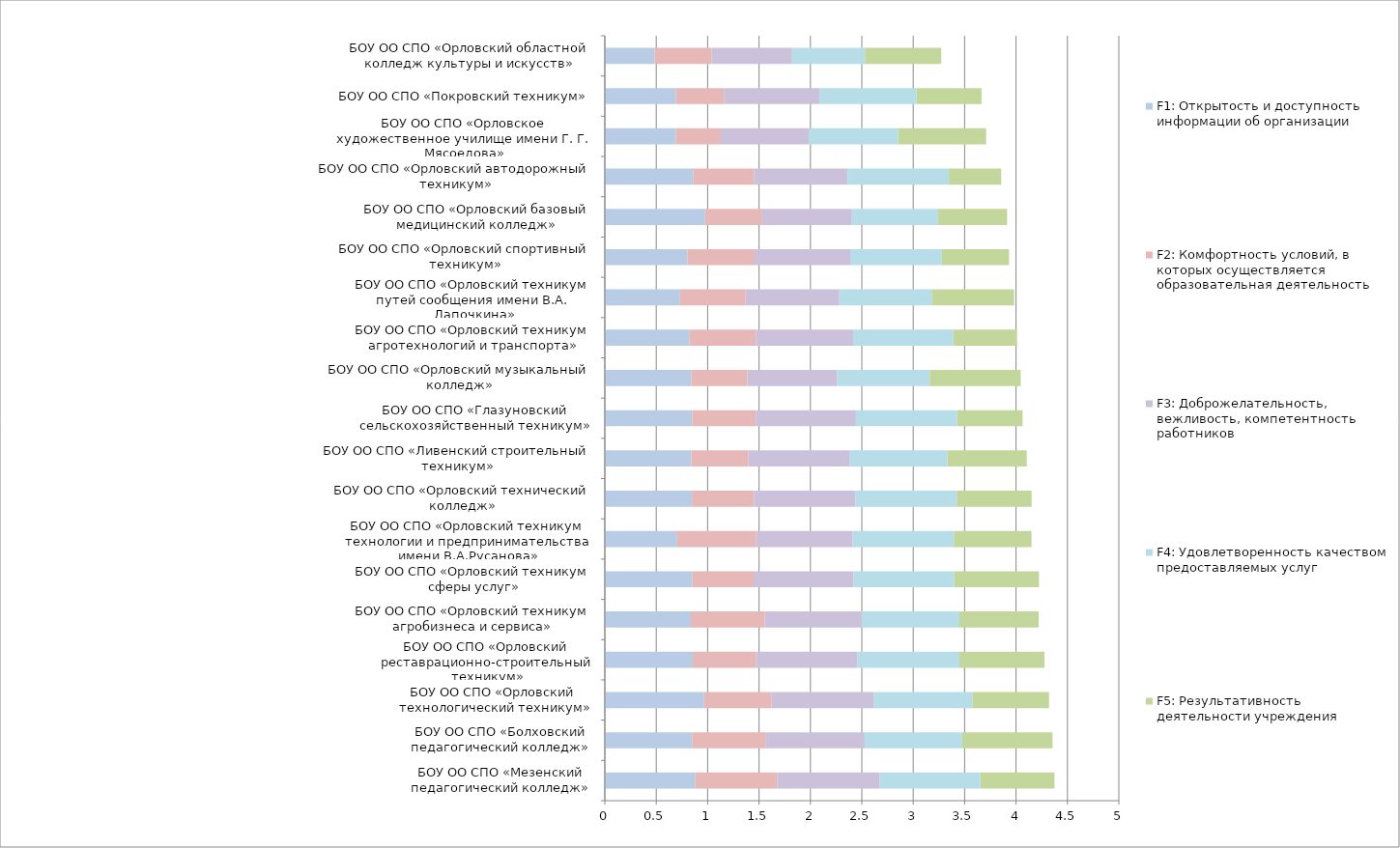
| Category | F1: Открытость и доступность информации об организации | F2: Комфортность условий, в которых осуществляется образовательная деятельность | F3: Доброжелательность, вежливость, компетентность работников | F4: Удовлетворенность качеством предоставляемых услуг | F5: Результативность деятельности учреждения |
|---|---|---|---|---|---|
| БОУ ОО СПО «Мезенский педагогический колледж» | 0.877 | 0.802 | 0.996 | 0.978 | 0.721 |
| БОУ ОО СПО «Болховский педагогический колледж» | 0.848 | 0.713 | 0.966 | 0.949 | 0.879 |
| БОУ ОО СПО «Орловский  технологический техникум» | 0.966 | 0.657 | 0.996 | 0.958 | 0.745 |
| БОУ ОО СПО «Орловский реставрационно-строительный техникум» | 0.856 | 0.617 | 0.986 | 0.991 | 0.827 |
| БОУ ОО СПО «Орловский техникум агробизнеса и сервиса» | 0.836 | 0.719 | 0.943 | 0.952 | 0.77 |
| БОУ ОО СПО «Орловский техникум сферы услуг» | 0.851 | 0.597 | 0.972 | 0.98 | 0.824 |
| БОУ ОО СПО «Орловский техникум технологии и предпринимательства имени В.А.Русанова» | 0.704 | 0.769 | 0.939 | 0.984 | 0.755 |
| БОУ ОО СПО «Орловский технический колледж» | 0.847 | 0.607 | 0.984 | 0.986 | 0.727 |
| БОУ ОО СПО «Ливенский строительный техникум» | 0.842 | 0.555 | 0.982 | 0.953 | 0.773 |
| БОУ ОО СПО «Глазуновский сельскохозяйственный техникум» | 0.849 | 0.619 | 0.974 | 0.985 | 0.636 |
| БОУ ОО СПО «Орловский музыкальный колледж» | 0.843 | 0.542 | 0.875 | 0.9 | 0.886 |
| БОУ ОО СПО «Орловский техникум агротехнологий и транспорта» | 0.822 | 0.65 | 0.944 | 0.975 | 0.619 |
| БОУ ОО СПО «Орловский техникум путей сообщения имени В.А. Лапочкина» | 0.731 | 0.639 | 0.911 | 0.899 | 0.802 |
| БОУ ОО СПО «Орловский спортивный техникум» | 0.803 | 0.654 | 0.931 | 0.891 | 0.654 |
| БОУ ОО СПО «Орловский базовый медицинский колледж» | 0.976 | 0.556 | 0.872 | 0.84 | 0.67 |
| БОУ ОО СПО «Орловский автодорожный техникум» | 0.858 | 0.595 | 0.907 | 0.987 | 0.509 |
| БОУ ОО СПО «Орловское художественное училище имени Г. Г. Мясоедова» | 0.69 | 0.437 | 0.855 | 0.871 | 0.856 |
| БОУ ОО СПО «Покровский техникум» | 0.691 | 0.467 | 0.929 | 0.944 | 0.633 |
| БОУ ОО СПО «Орловский областной колледж культуры и искусств» | 0.483 | 0.556 | 0.782 | 0.71 | 0.741 |